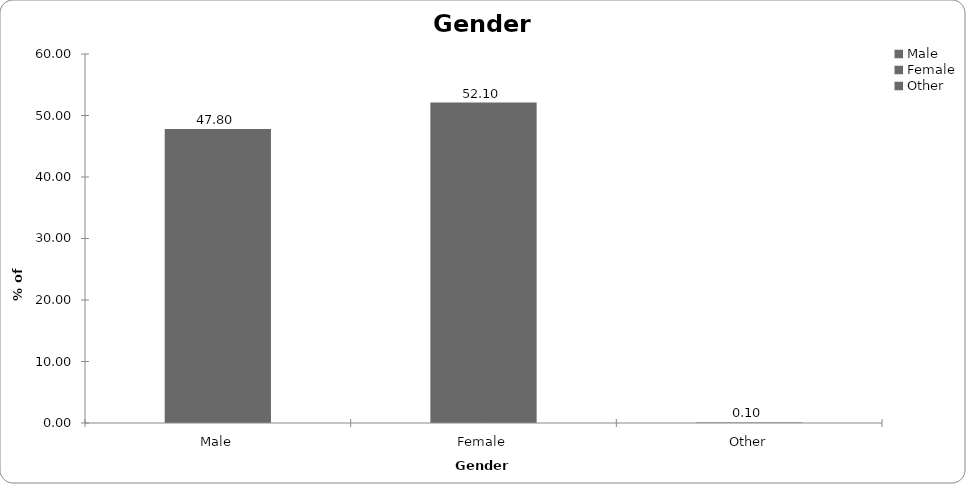
| Category | Series 0 |
|---|---|
| Male | 47.8 |
| Female | 52.1 |
| Other | 0.1 |